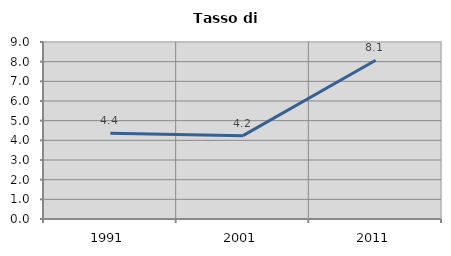
| Category | Tasso di disoccupazione   |
|---|---|
| 1991.0 | 4.366 |
| 2001.0 | 4.237 |
| 2011.0 | 8.075 |